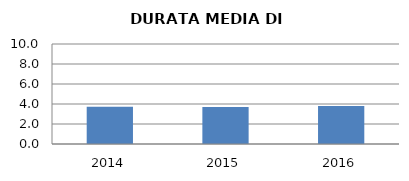
| Category | 2014 2015 2016 |
|---|---|
| 2014.0 | 3.713 |
| 2015.0 | 3.707 |
| 2016.0 | 3.812 |